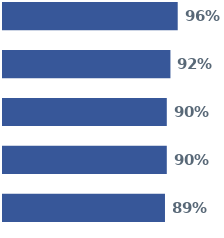
| Category | Series 0 | Series 1 | Series 2 | Series 3 | Series 4 |
|---|---|---|---|---|---|
| 0 | 0.96 | 0.92 | 0.9 | 0.9 | 0.89 |